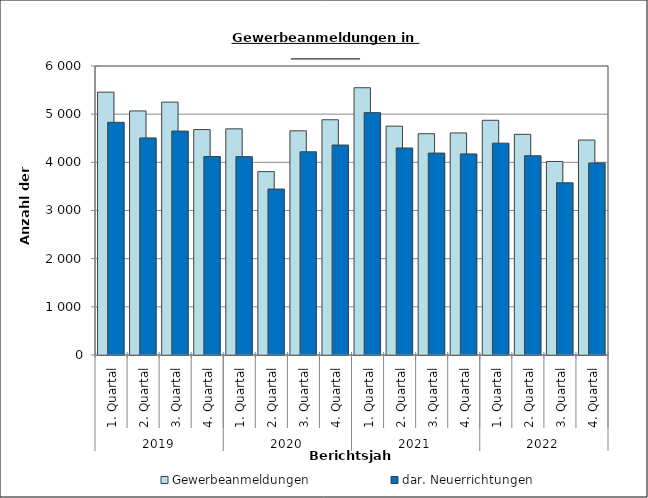
| Category | Gewerbeanmeldungen | dar. Neuerrichtungen |
|---|---|---|
| 0 | 5457 | 4831 |
| 1 | 5067 | 4507 |
| 2 | 5250 | 4649 |
| 3 | 4680 | 4121 |
| 4 | 4695 | 4118 |
| 5 | 3807 | 3445 |
| 6 | 4654 | 4219 |
| 7 | 4884 | 4359 |
| 8 | 5549 | 5032 |
| 9 | 4751 | 4298 |
| 10 | 4594 | 4192 |
| 11 | 4610 | 4174 |
| 12 | 4873 | 4398 |
| 13 | 4581 | 4137 |
| 14 | 4018 | 3576 |
| 15 | 4463 | 3987 |